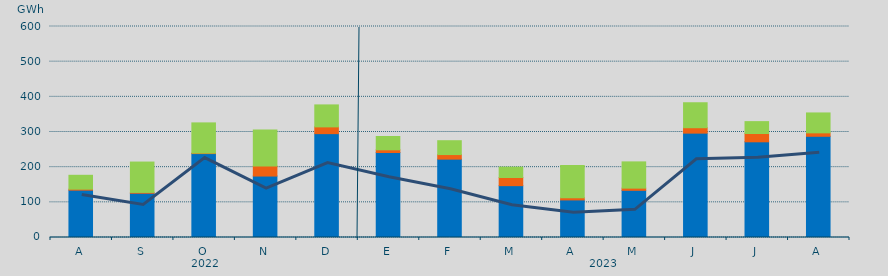
| Category | Asignación SEPE | Asignación Francia | Asignación Portugal |
|---|---|---|---|
| A | 134609.35 | 2839.1 | 39441.4 |
| S | 125828.7 | 2385 | 86328.9 |
| O | 238619.175 | 1385 | 85885 |
| N | 174742.7 | 28420.1 | 102571.3 |
| D | 295334.825 | 19231.9 | 62469.6 |
| E | 241649.025 | 7715.1 | 37807.2 |
| F | 222841.2 | 13030.5 | 39359.9 |
| M | 147441.275 | 23234.4 | 29375.8 |
| A | 106835.5 | 6126.3 | 91808.3 |
| M | 134157.925 | 6210.9 | 74632.6 |
| J | 296773.85 | 15418.6 | 70990 |
| J | 272106 | 23610.9 | 33804.6 |
| A | 287813.1 | 9754 | 56632.6 |